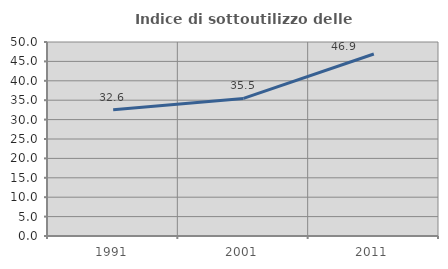
| Category | Indice di sottoutilizzo delle abitazioni  |
|---|---|
| 1991.0 | 32.561 |
| 2001.0 | 35.457 |
| 2011.0 | 46.912 |